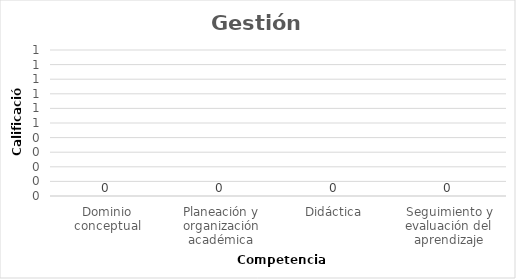
| Category | Series 0 |
|---|---|
| Dominio conceptual | 0 |
| Planeación y organización académica | 0 |
| Didáctica | 0 |
| Seguimiento y evaluación del aprendizaje | 0 |